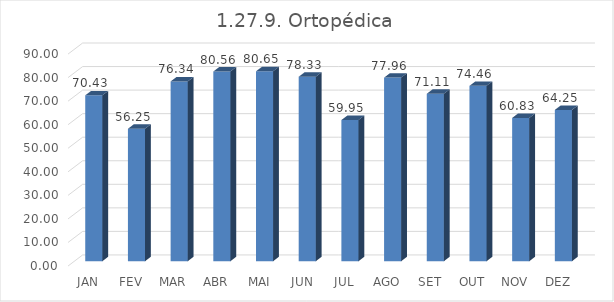
| Category | 1.27.9. Ortopédica |
|---|---|
|  JAN  | 70.43 |
|  FEV  | 56.25 |
|  MAR  | 76.344 |
|  ABR  | 80.556 |
|  MAI  | 80.645 |
|  JUN  | 78.333 |
|  JUL  | 59.946 |
|  AGO  | 77.957 |
|  SET  | 71.111 |
|  OUT  | 74.462 |
|  NOV  | 60.833 |
|  DEZ  | 64.247 |